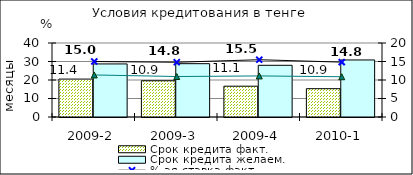
| Category | Срок кредита факт.  | Срок кредита желаем. |
|---|---|---|
| 2009-2 | 20.49 | 28.69 |
| 2009-3 | 19.59 | 28.82 |
| 2009-4 | 16.65 | 27.94 |
| 2010-1 | 15.31 | 30.83 |